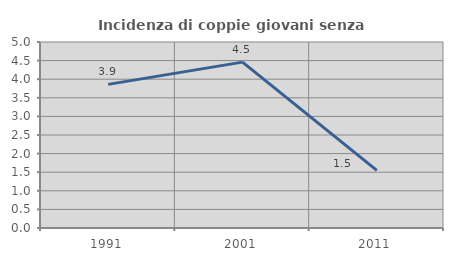
| Category | Incidenza di coppie giovani senza figli |
|---|---|
| 1991.0 | 3.86 |
| 2001.0 | 4.459 |
| 2011.0 | 1.549 |